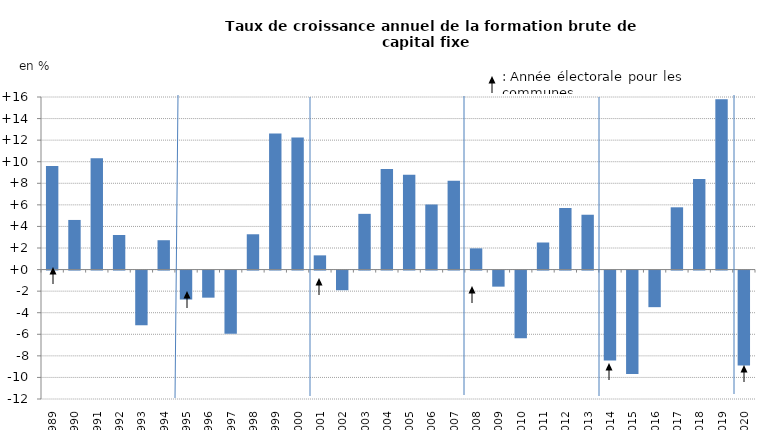
| Category | taux de croissance annuel de la FBCF des APUL |
|---|---|
| 1989.0 | 9.607 |
| 1990.0 | 4.601 |
| 1991.0 | 10.317 |
| 1992.0 | 3.205 |
| 1993.0 | -5.07 |
| 1994.0 | 2.722 |
| 1995.0 | -2.685 |
| 1996.0 | -2.511 |
| 1997.0 | -5.866 |
| 1998.0 | 3.273 |
| 1999.0 | 12.618 |
| 2000.0 | 12.235 |
| 2001.0 | 1.317 |
| 2002.0 | -1.82 |
| 2003.0 | 5.166 |
| 2004.0 | 9.33 |
| 2005.0 | 8.792 |
| 2006.0 | 6.025 |
| 2007.0 | 8.226 |
| 2008.0 | 1.967 |
| 2009.0 | -1.49 |
| 2010.0 | -6.267 |
| 2011.0 | 2.51 |
| 2012.0 | 5.707 |
| 2013.0 | 5.084 |
| 2014.0 | -8.328 |
| 2015.0 | -9.579 |
| 2016.0 | -3.393 |
| 2017.0 | 5.773 |
| 2018.0 | 8.396 |
| 2019.0 | 15.791 |
| 2020.0 | -8.802 |